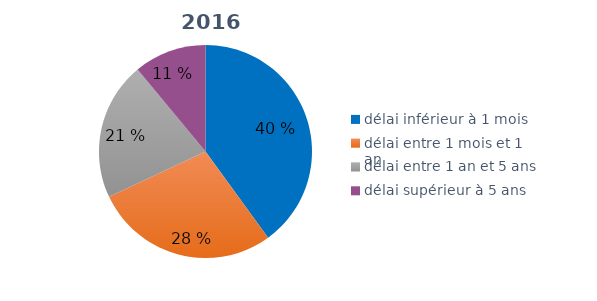
| Category | Series 0 |
|---|---|
| délai inférieur à 1 mois | 0.4 |
| délai entre 1 mois et 1 an | 0.28 |
| délai entre 1 an et 5 ans | 0.21 |
| délai supérieur à 5 ans | 0.11 |